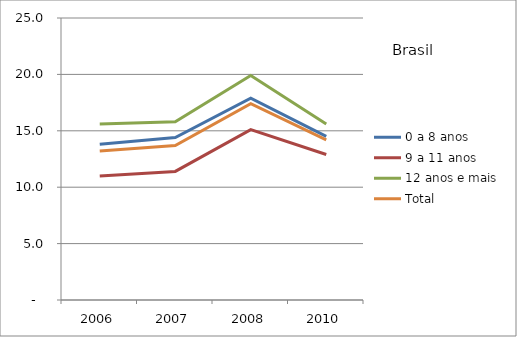
| Category | 0 a 8 anos | 9 a 11 anos | 12 anos e mais | Total |
|---|---|---|---|---|
| 2006.0 | 13.8 | 11 | 15.6 | 13.2 |
| 2007.0 | 14.4 | 11.4 | 15.8 | 13.7 |
| 2008.0 | 17.9 | 15.1 | 19.9 | 17.4 |
| 2010.0 | 14.5 | 12.9 | 15.6 | 14.2 |